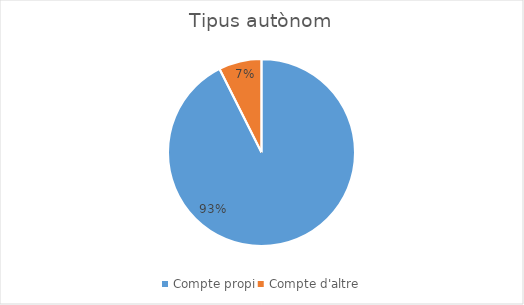
| Category | Series 0 |
|---|---|
| Compte propi | 75 |
| Compte d'altre | 6 |